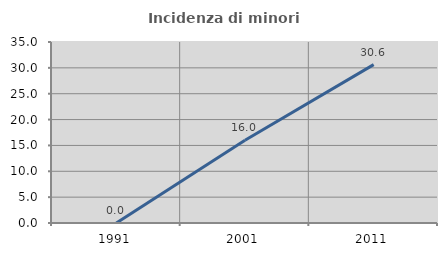
| Category | Incidenza di minori stranieri |
|---|---|
| 1991.0 | 0 |
| 2001.0 | 16 |
| 2011.0 | 30.631 |